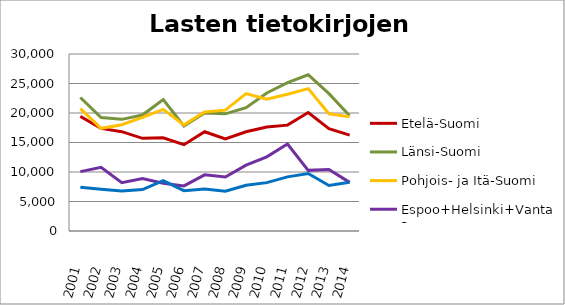
| Category | Etelä-Suomi | Länsi-Suomi | Pohjois- ja Itä-Suomi | Espoo+Helsinki+Vantaa | Muu Uusimaa |
|---|---|---|---|---|---|
| 2001.0 | 19430 | 22620 | 20749 | 10066 | 7419 |
| 2002.0 | 17385 | 19223 | 17401 | 10793 | 7079 |
| 2003.0 | 16837 | 18924 | 18008 | 8183 | 6770 |
| 2004.0 | 15707 | 19652 | 19262 | 8911 | 7016 |
| 2005.0 | 15802 | 22292 | 20611 | 8108 | 8523 |
| 2006.0 | 14626 | 17803 | 17985 | 7641 | 6831 |
| 2007.0 | 16828 | 20010 | 20160 | 9516 | 7109 |
| 2008.0 | 15589 | 19855 | 20487 | 9157 | 6740 |
| 2009.0 | 16811 | 20906 | 23276 | 11150 | 7754 |
| 2010.0 | 17626 | 23387 | 22325 | 12576 | 8197 |
| 2011.0 | 17940 | 25135 | 23169 | 14753 | 9172 |
| 2012.0 | 20076 | 26485 | 24133 | 10276 | 9736 |
| 2013.0 | 17357 | 23278 | 19869 | 10428 | 7704 |
| 2014.0 | 16253 | 19536 | 19349 | 8244 | 8266 |